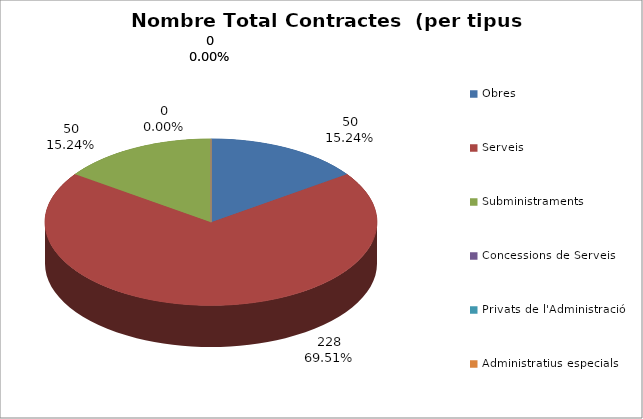
| Category | Nombre Total Contractes |
|---|---|
| Obres | 50 |
| Serveis | 228 |
| Subministraments | 50 |
| Concessions de Serveis | 0 |
| Privats de l'Administració | 0 |
| Administratius especials | 0 |